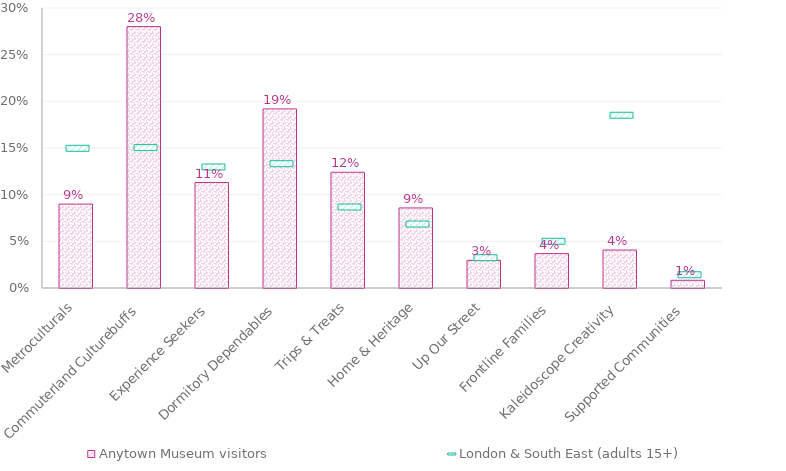
| Category | Anytown Museum visitors |
|---|---|
| Metroculturals | 0.09 |
| Commuterland Culturebuffs | 0.28 |
| Experience Seekers | 0.113 |
| Dormitory Dependables | 0.192 |
| Trips & Treats | 0.124 |
| Home & Heritage | 0.086 |
| Up Our Street | 0.03 |
| Frontline Families | 0.037 |
| Kaleidoscope Creativity | 0.041 |
| Supported Communities | 0.008 |